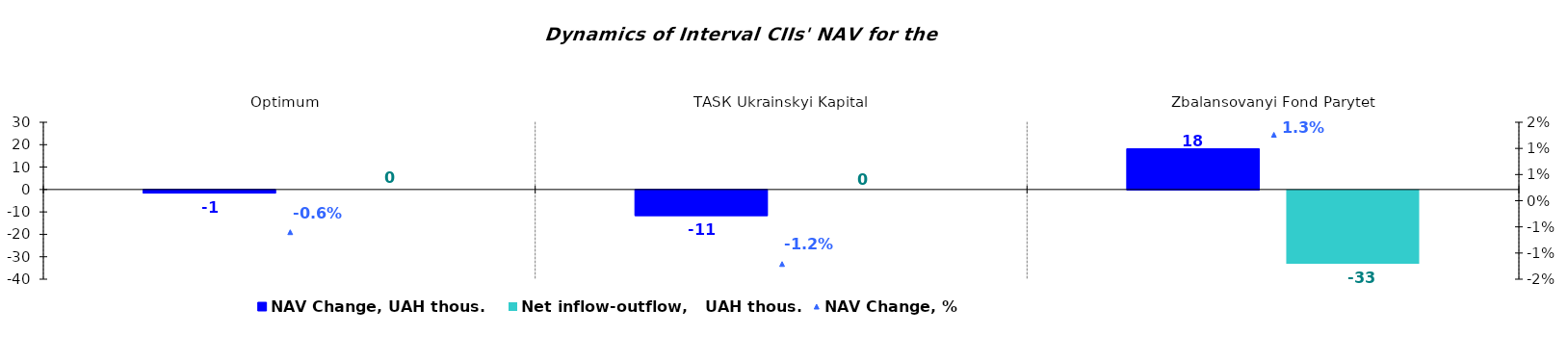
| Category | NAV Change, UAH thous. | Net inflow-outflow,   UAH thous. |
|---|---|---|
| Optimum  | -1.393 | 0 |
| ТАSК Ukrainskyi Kapital | -11.408 | 0 |
| Zbalansovanyi Fond Parytet | 18.173 | -32.661 |